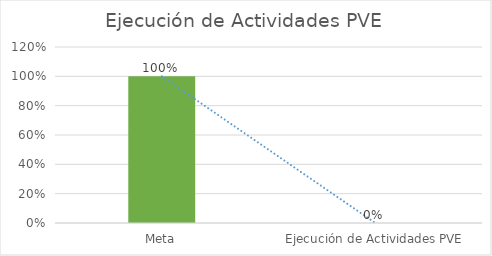
| Category | Series 0 |
|---|---|
| Meta | 1 |
| Ejecución de Actividades PVE | 0 |